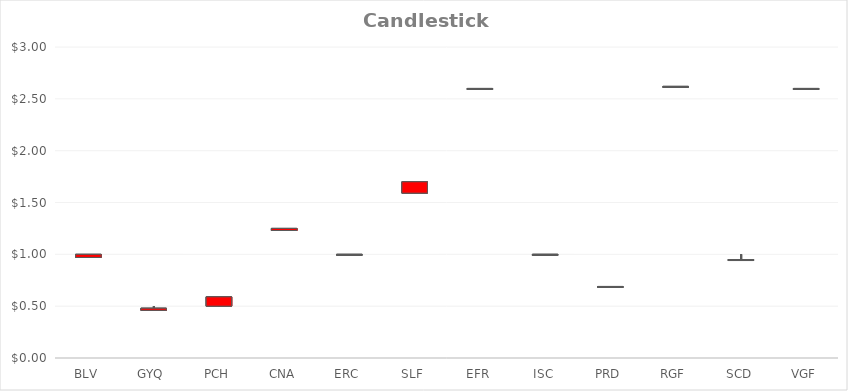
| Category | Open Mayo 2 | High | Low | Close Mayo 31 |
|---|---|---|---|---|
| BLV | 1 | 1 | 0.97 | 0.97 |
| GYQ | 0.48 | 0.5 | 0.46 | 0.46 |
| PCH | 0.59 | 0.59 | 0.5 | 0.5 |
| CNA | 1.25 | 1.25 | 1.23 | 1.23 |
| ERC | 1 | 1 | 1 | 1 |
| SLF | 1.7 | 1.7 | 1.59 | 1.59 |
| EFR | 2.6 | 2.6 | 2.6 | 2.6 |
| ISC | 1 | 1 | 1 | 1 |
| PRD | 0.69 | 0.69 | 0.69 | 0.69 |
| RGF | 2.62 | 2.62 | 2.62 | 2.62 |
| SCD | 0.95 | 1 | 0.95 | 0.95 |
| VGF | 2.6 | 2.6 | 2.6 | 2.6 |